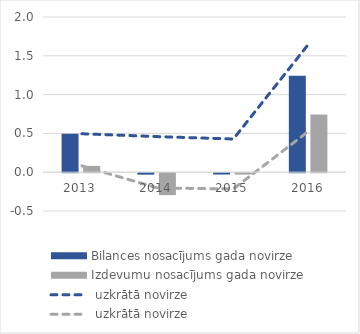
| Category | Bilances nosacījums gada novirze | Izdevumu nosacījums gada novirze |
|---|---|---|
| 2013.0 | 0.495 | 0.081 |
| 2014.0 | -0.019 | -0.282 |
| 2015.0 | -0.017 | -0.018 |
| 2016.0 | 1.243 | 0.743 |